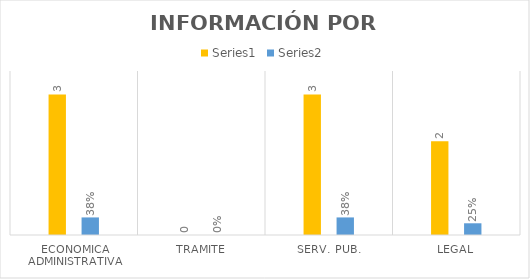
| Category | Series 3 | Series 4 |
|---|---|---|
| ECONOMICA ADMINISTRATIVA | 3 | 0.375 |
| TRAMITE | 0 | 0 |
| SERV. PUB. | 3 | 0.375 |
| LEGAL | 2 | 0.25 |